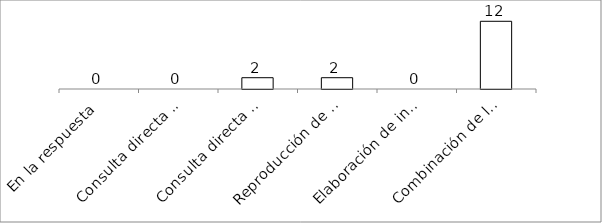
| Category | Series 0 |
|---|---|
| En la respuesta | 0 |
| Consulta directa personal | 0 |
| Consulta directa electrónica | 2 |
| Reproducción de documentos | 2 |
| Elaboración de informes | 0 |
| Combinación de las anteriores | 12 |